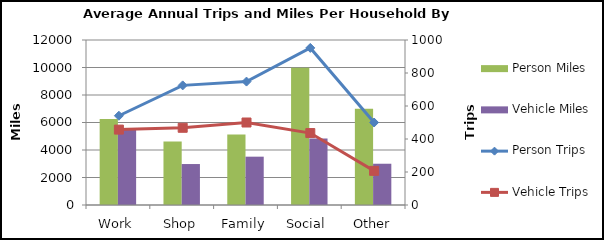
| Category | Person Miles | Vehicle Miles |
|---|---|---|
| Work | 6256 | 5513 |
| Shop | 4620 | 2979 |
| Family | 5134 | 3515 |
| Social  | 9989 | 4842 |
| Other | 7005 | 3001 |